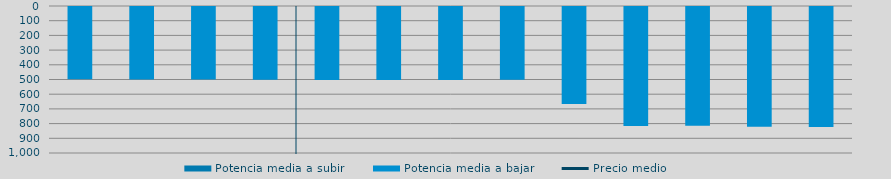
| Category | Potencia media a subir | Potencia media a bajar |
|---|---|---|
| 0 |  | 490.681 |
| 1 |  | 493.046 |
| 2 |  | 494.01 |
| 3 |  | 494.269 |
| 4 |  | 496 |
| 5 |  | 495.792 |
| 6 |  | 497.176 |
| 7 |  | 494.972 |
| 8 |  | 660 |
| 9 |  | 809.502 |
| 10 |  | 808.05 |
| 11 |  | 814.726 |
| 12 |  | 815.741 |